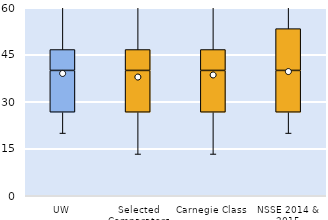
| Category | 25th | 50th | 75th |
|---|---|---|---|
| UW | 26.667 | 13.333 | 6.667 |
| Selected Comparators | 26.667 | 13.333 | 6.667 |
| Carnegie Class | 26.667 | 13.333 | 6.667 |
| NSSE 2014 & 2015 | 26.667 | 13.333 | 13.333 |